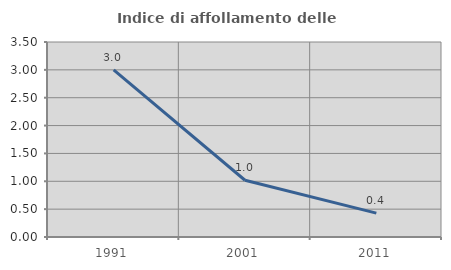
| Category | Indice di affollamento delle abitazioni  |
|---|---|
| 1991.0 | 3.001 |
| 2001.0 | 1.018 |
| 2011.0 | 0.429 |